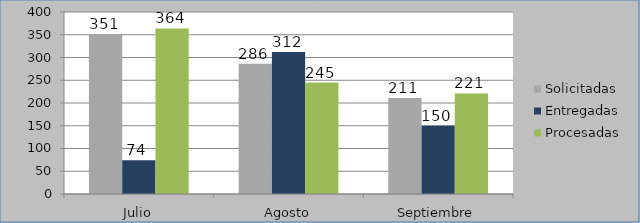
| Category | Solicitadas | Entregadas | Procesadas |
|---|---|---|---|
| Julio | 351 | 74 | 364 |
| Agosto | 286 | 312 | 245 |
| Septiembre | 211 | 150 | 221 |